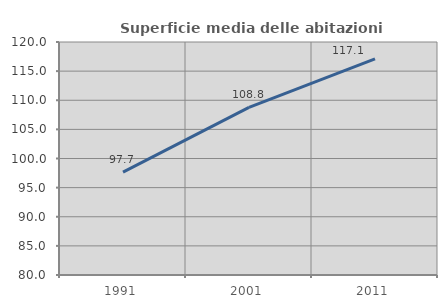
| Category | Superficie media delle abitazioni occupate |
|---|---|
| 1991.0 | 97.651 |
| 2001.0 | 108.789 |
| 2011.0 | 117.116 |